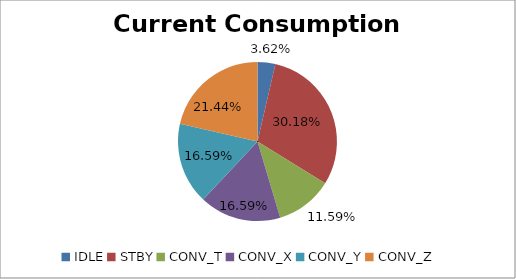
| Category | Series 0 |
|---|---|
| IDLE | 2.326 |
| STBY | 19.385 |
| CONV_T | 7.444 |
| CONV_X | 10.654 |
| CONV_Y | 10.654 |
| CONV_Z | 13.771 |